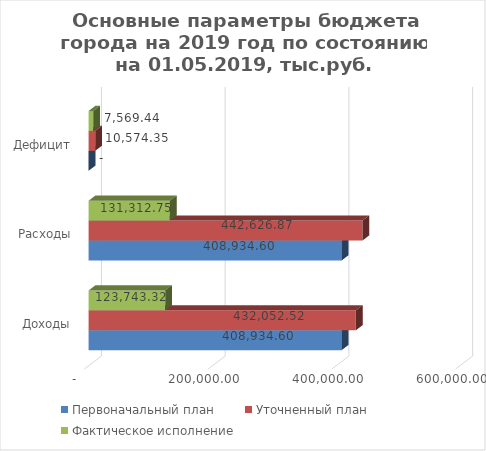
| Category | Первоначальный план | Уточненный план | Фактическое исполнение |
|---|---|---|---|
| Доходы | 408934.598 | 432052.518 | 123743.317 |
| Расходы | 408934.598 | 442626.866 | 131312.753 |
| Дефицит | 0 | 10574.348 | 7569.436 |